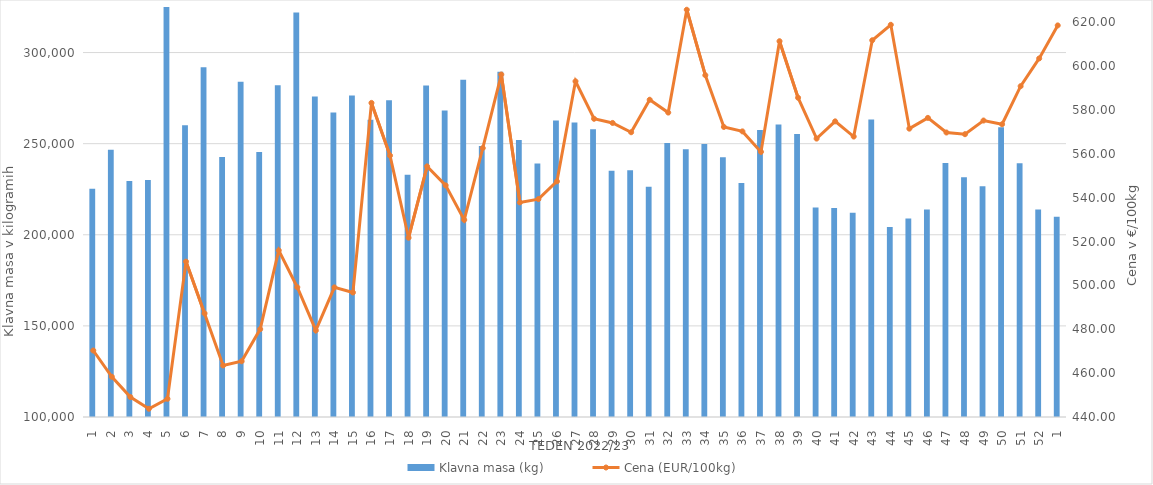
| Category | Klavna masa (kg) |
|---|---|
| 1.0 | 225300 |
| 2.0 | 246712 |
| 3.0 | 229541 |
| 4.0 | 230074 |
| 5.0 | 328640 |
| 6.0 | 260108 |
| 7.0 | 291887 |
| 8.0 | 242732 |
| 9.0 | 283987 |
| 10.0 | 245414 |
| 11.0 | 282092 |
| 12.0 | 321936 |
| 13.0 | 275950 |
| 14.0 | 267148 |
| 15.0 | 276417 |
| 16.0 | 263098 |
| 17.0 | 273824 |
| 18.0 | 232926 |
| 19.0 | 281859 |
| 20.0 | 268153 |
| 21.0 | 285073 |
| 22.0 | 248783 |
| 23.0 | 289478 |
| 24.0 | 252069 |
| 25.0 | 239099 |
| 26.0 | 262689 |
| 27.0 | 261656 |
| 28.0 | 257905 |
| 29.0 | 235185 |
| 30.0 | 235475 |
| 31.0 | 226322 |
| 32.0 | 250418 |
| 33.0 | 246996 |
| 34.0 | 249873 |
| 35.0 | 242516 |
| 36.0 | 228469 |
| 37.0 | 257511 |
| 38.0 | 260481 |
| 39.0 | 255370 |
| 40.0 | 214936 |
| 41.0 | 214672 |
| 42.0 | 212066 |
| 43.0 | 263287 |
| 44.0 | 204280 |
| 45.0 | 208920 |
| 46.0 | 213836 |
| 47.0 | 239417 |
| 48.0 | 231565 |
| 49.0 | 226575 |
| 50.0 | 259073 |
| 51.0 | 239211 |
| 52.0 | 213841 |
| 1.0 | 209877 |